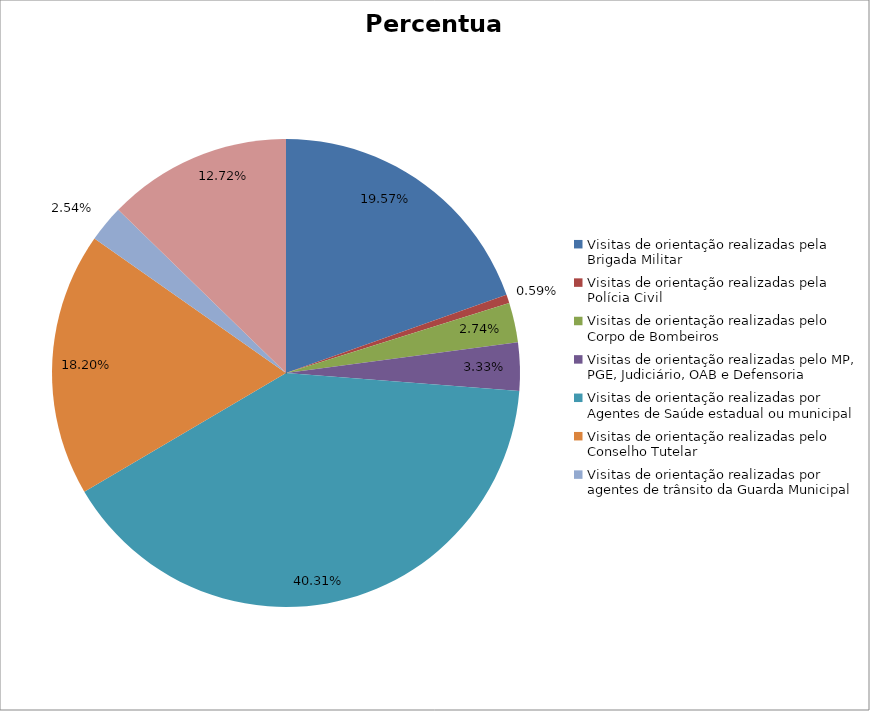
| Category | Percentual |
|---|---|
| Visitas de orientação realizadas pela Brigada Militar | 0.196 |
| Visitas de orientação realizadas pela Polícia Civil | 0.006 |
| Visitas de orientação realizadas pelo Corpo de Bombeiros | 0.027 |
| Visitas de orientação realizadas pelo MP, PGE, Judiciário, OAB e Defensoria | 0.033 |
| Visitas de orientação realizadas por Agentes de Saúde estadual ou municipal | 0.403 |
| Visitas de orientação realizadas pelo Conselho Tutelar | 0.182 |
| Visitas de orientação realizadas por agentes de trânsito da Guarda Municipal | 0.025 |
| Visitas de orientação realizadas por ONGs, entidades privadas, CRAS e CREAS | 0.127 |